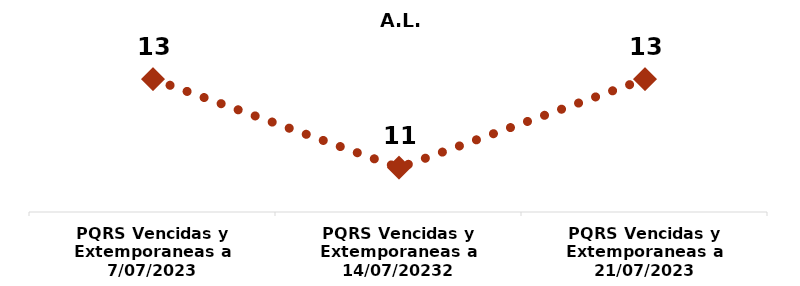
| Category | A.L. TEUSAQUILLO |
|---|---|
| PQRS Vencidas y Extemporaneas a 7/07/2023 | 13 |
| PQRS Vencidas y Extemporaneas a 14/07/20232 | 11 |
| PQRS Vencidas y Extemporaneas a 21/07/2023 | 13 |